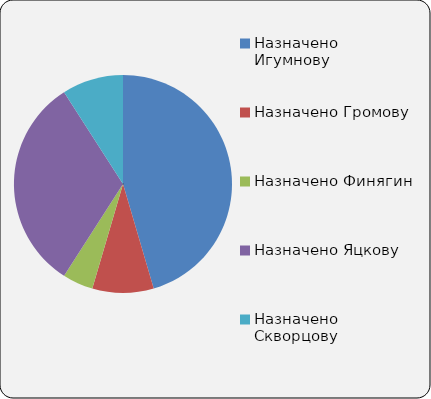
| Category | Series 0 |
|---|---|
| Назначено Игумнову | 10 |
| Назначено Громову | 2 |
| Назначено Финягин | 1 |
| Назначено Яцкову | 7 |
| Назначено Скворцову | 2 |